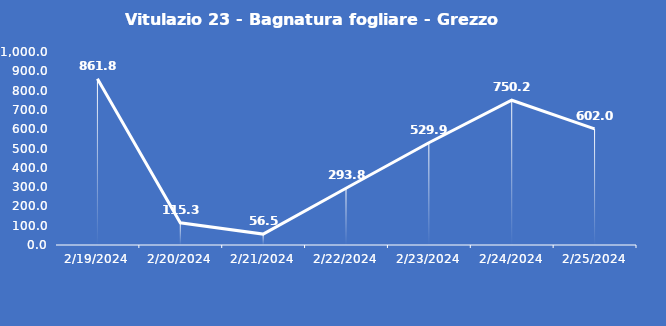
| Category | Vitulazio 23 - Bagnatura fogliare - Grezzo (min) |
|---|---|
| 2/19/24 | 861.8 |
| 2/20/24 | 115.3 |
| 2/21/24 | 56.5 |
| 2/22/24 | 293.8 |
| 2/23/24 | 529.9 |
| 2/24/24 | 750.2 |
| 2/25/24 | 602 |